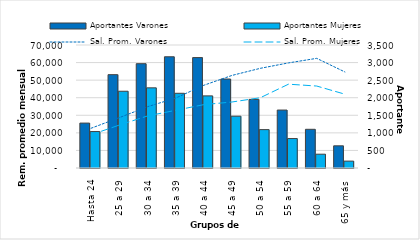
| Category | Aportantes Varones | Aportantes Mujeres |
|---|---|---|
| Hasta 24 | 1278 | 1037 |
| 25 a 29 | 2656 | 2184 |
| 30 a 34 | 2968 | 2281 |
| 35 a 39 | 3165 | 2126 |
| 40 a 44 | 3142 | 2052 |
| 45 a 49 | 2532 | 1474 |
| 50 a 54 | 1952 | 1092 |
| 55 a 59 | 1649 | 838 |
| 60 a 64 | 1101 | 393 |
| 65 y más | 631 | 196 |